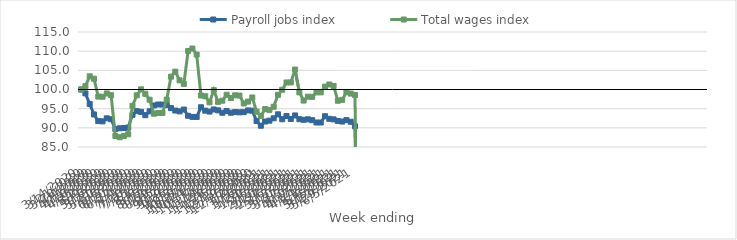
| Category | Payroll jobs index | Total wages index |
|---|---|---|
| 14/03/2020 | 100 | 100 |
| 21/03/2020 | 98.989 | 100.861 |
| 28/03/2020 | 96.225 | 103.442 |
| 04/04/2020 | 93.487 | 102.817 |
| 11/04/2020 | 91.759 | 98.153 |
| 18/04/2020 | 91.686 | 98.109 |
| 25/04/2020 | 92.484 | 98.974 |
| 02/05/2020 | 92.242 | 98.523 |
| 09/05/2020 | 89.686 | 87.884 |
| 16/05/2020 | 89.879 | 87.544 |
| 23/05/2020 | 89.964 | 87.891 |
| 30/05/2020 | 90.07 | 88.322 |
| 06/06/2020 | 93.39 | 95.74 |
| 13/06/2020 | 94.352 | 98.496 |
| 20/06/2020 | 94.164 | 100.042 |
| 27/06/2020 | 93.299 | 98.881 |
| 04/07/2020 | 94.311 | 97.33 |
| 11/07/2020 | 95.842 | 93.679 |
| 18/07/2020 | 96.089 | 93.871 |
| 25/07/2020 | 96.073 | 93.897 |
| 01/08/2020 | 95.973 | 97.364 |
| 08/08/2020 | 95.139 | 103.348 |
| 15/08/2020 | 94.51 | 104.65 |
| 22/08/2020 | 94.293 | 102.396 |
| 29/08/2020 | 94.777 | 101.464 |
| 05/09/2020 | 93.147 | 110.055 |
| 12/09/2020 | 92.86 | 110.684 |
| 19/09/2020 | 92.84 | 109.109 |
| 26/09/2020 | 95.367 | 98.44 |
| 03/10/2020 | 94.481 | 98.239 |
| 10/10/2020 | 94.239 | 96.654 |
| 17/10/2020 | 94.795 | 99.828 |
| 24/10/2020 | 94.559 | 96.777 |
| 31/10/2020 | 93.934 | 97.079 |
| 07/11/2020 | 94.383 | 98.633 |
| 14/11/2020 | 93.939 | 97.784 |
| 21/11/2020 | 94.107 | 98.488 |
| 28/11/2020 | 94.047 | 98.416 |
| 05/12/2020 | 94.092 | 96.363 |
| 12/12/2020 | 94.542 | 96.837 |
| 19/12/2020 | 94.48 | 97.918 |
| 26/12/2020 | 91.789 | 94.208 |
| 02/01/2021 | 90.548 | 93.13 |
| 09/01/2021 | 91.654 | 94.893 |
| 16/01/2021 | 91.867 | 94.67 |
| 23/01/2021 | 92.481 | 95.504 |
| 30/01/2021 | 93.524 | 98.613 |
| 06/02/2021 | 92.236 | 99.932 |
| 13/02/2021 | 93.079 | 101.836 |
| 20/02/2021 | 92.308 | 101.846 |
| 27/02/2021 | 93.232 | 105.212 |
| 06/03/2021 | 92.252 | 99.263 |
| 13/03/2021 | 92.09 | 97.11 |
| 20/03/2021 | 92.226 | 98.124 |
| 27/03/2021 | 91.996 | 98.087 |
| 03/04/2021 | 91.391 | 99.252 |
| 10/04/2021 | 91.391 | 99.252 |
| 17/04/2021 | 93.031 | 100.756 |
| 24/04/2021 | 92.35 | 101.31 |
| 01/05/2021 | 92.204 | 100.922 |
| 08/05/2021 | 91.791 | 97.071 |
| 15/05/2021 | 91.639 | 97.294 |
| 22/05/2021 | 92.016 | 99.294 |
| 29/05/2021 | 91.586 | 98.941 |
| 05/06/2021 | 90.418 | 98.562 |